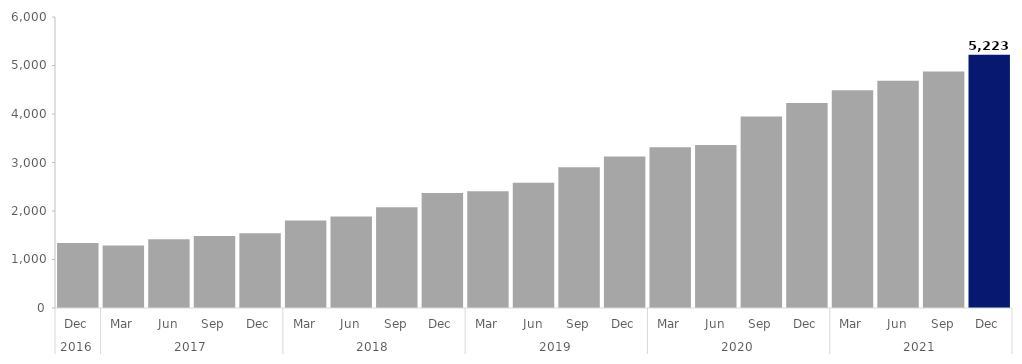
| Category | Series 0 |
|---|---|
| 0 | 1338 |
| 1 | 1290 |
| 2 | 1419 |
| 3 | 1482 |
| 4 | 1542 |
| 5 | 1806 |
| 6 | 1887 |
| 7 | 2076 |
| 8 | 2373 |
| 9 | 2406 |
| 10 | 2580 |
| 11 | 2901 |
| 12 | 3126 |
| 13 | 3312 |
| 14 | 3360 |
| 15 | 3948 |
| 16 | 4227 |
| 17 | 4488 |
| 18 | 4686 |
| 19 | 4875 |
| 20 | 5223 |